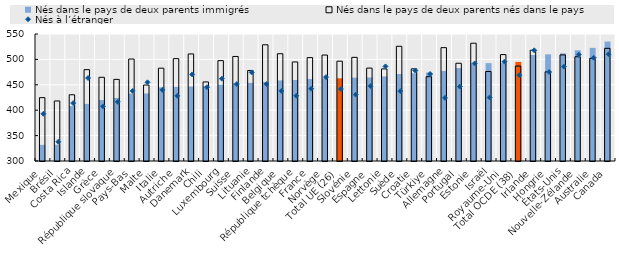
| Category | Nés dans le pays de deux parents immigrés | Nés dans le pays de deux parents nés dans le pays |
|---|---|---|
| Mexique | 331.759 | 424.689 |
| Brésil | 331.984 | 418.179 |
| Costa Rica | 408.111 | 430.364 |
| Islande | 412.436 | 479.839 |
| Grèce | 420.118 | 464.747 |
| République slovaque | 424.137 | 460.666 |
| Pays-Bas | 432.666 | 500.719 |
| Malte | 432.882 | 449.57 |
| Italie | 444.972 | 482.672 |
| Autriche | 445.846 | 501.497 |
| Danemark | 446.535 | 510.73 |
| Chili | 447.058 | 455.636 |
| Luxembourg | 450.114 | 497.577 |
| Suisse | 453.284 | 505.793 |
| Lituanie | 453.726 | 478.12 |
| Finlande | 455.648 | 528.807 |
| Belgique | 458.641 | 511.183 |
| République tchèque | 459.458 | 494.945 |
| France | 461.324 | 503.501 |
| Norvège | 462.686 | 508.567 |
| Total UE (26) | 462.762 | 496.493 |
| Slovénie | 464.081 | 504.023 |
| Espagne | 464.415 | 482.896 |
| Lettonie | 466.557 | 481.298 |
| Suède | 471.18 | 525.803 |
| Croatie | 472.798 | 481.428 |
| Türkiye | 474.26 | 465.962 |
| Allemagne | 477.306 | 523.119 |
| Portugal | 482.883 | 492.412 |
| Estonie | 492.166 | 531.879 |
| Israël | 492.671 | 476.138 |
| Royaume-Uni | 492.84 | 509.456 |
| Total OCDE (38) | 495.081 | 486.887 |
| Irlande | 508.811 | 518.03 |
| Hongrie | 509.923 | 475.562 |
| États-Unis | 511.905 | 508.846 |
| Nouvelle-Zélande | 517.888 | 505.158 |
| Australie | 522.694 | 501.927 |
| Canada | 535.211 | 521.776 |